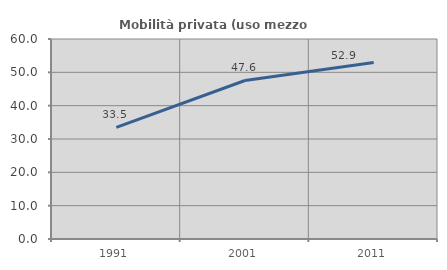
| Category | Mobilità privata (uso mezzo privato) |
|---|---|
| 1991.0 | 33.488 |
| 2001.0 | 47.554 |
| 2011.0 | 52.931 |